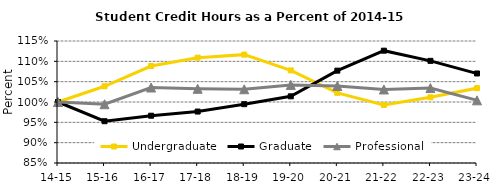
| Category | Undergraduate | Graduate | Professional |
|---|---|---|---|
| 14-15 | 1 | 1 | 1 |
| 15-16 | 1.039 | 0.953 | 0.994 |
| 16-17 | 1.088 | 0.966 | 1.036 |
| 17-18 | 1.109 | 0.977 | 1.032 |
| 18-19 | 1.116 | 0.995 | 1.031 |
| 19-20 | 1.078 | 1.014 | 1.042 |
| 20-21 | 1.022 | 1.077 | 1.039 |
| 21-22 | 0.993 | 1.126 | 1.031 |
| 22-23 | 1.012 | 1.101 | 1.034 |
| 23-24 | 1.034 | 1.07 | 1.004 |